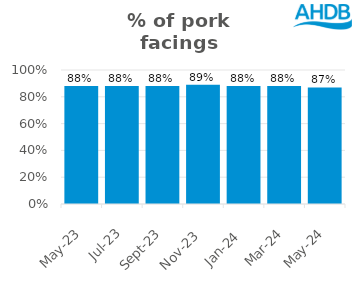
| Category | Pork |
|---|---|
| 2023-05-01 | 0.88 |
| 2023-07-01 | 0.88 |
| 2023-09-01 | 0.88 |
| 2023-11-01 | 0.89 |
| 2024-01-01 | 0.88 |
| 2024-03-01 | 0.88 |
| 2024-05-01 | 0.87 |